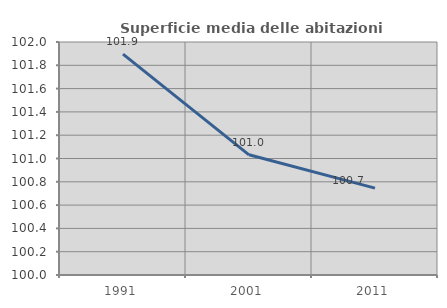
| Category | Superficie media delle abitazioni occupate |
|---|---|
| 1991.0 | 101.896 |
| 2001.0 | 101.032 |
| 2011.0 | 100.746 |